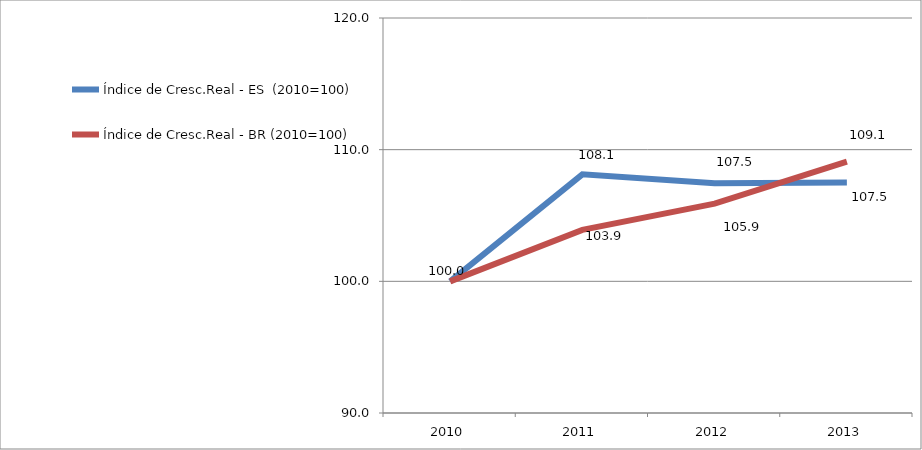
| Category | Índice de Cresc.Real - ES  (2010=100) | Índice de Cresc.Real - BR (2010=100) |
|---|---|---|
| 2010.0 | 100 | 100 |
| 2011.0 | 108.123 | 103.909 |
| 2012.0 | 107.453 | 105.902 |
| 2013.0 | 107.51 | 109.094 |